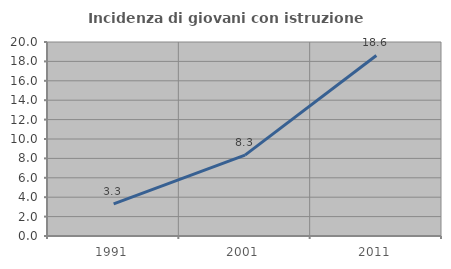
| Category | Incidenza di giovani con istruzione universitaria |
|---|---|
| 1991.0 | 3.312 |
| 2001.0 | 8.333 |
| 2011.0 | 18.613 |